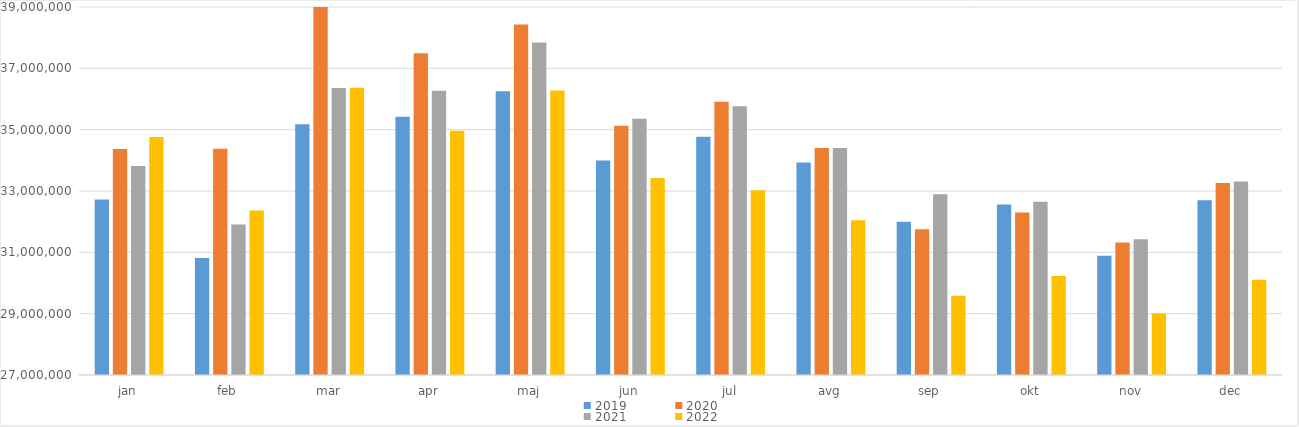
| Category | 2019 | 2020 | 2021 | 2022 |
|---|---|---|---|---|
| jan | 32719724 | 34373025 | 33811306 | 34763962 |
| feb | 30818386 | 34378181 | 31904415 | 32363756 |
| mar | 35178847 | 39135627 | 36360809 | 36367234 |
| apr | 35421396 | 37492638 | 36268855 | 34966419 |
| maj | 36255677 | 38431913 | 37838665 | 36278566 |
| jun | 33997200 | 35124374 | 35354150 | 33426181 |
| jul | 34768165 | 35907195 | 35762830 | 33021018 |
| avg | 33925651 | 34398749 | 34404707 | 32045700 |
| sep | 31997520 | 31752480 | 32890632 | 29581155 |
| okt | 32558357 | 32298850 | 32651777 | 30229660 |
| nov | 30886411 | 31318824 | 31425334 | 29006311 |
| dec | 32697617 | 33262055 | 33313552 | 30104885 |